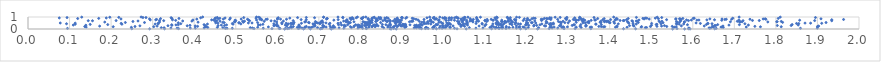
| Category | Series 0 |
|---|---|
| 0.6175389052844268 | 0.001 |
| 1.5514598803826851 | 0.002 |
| 0.8862261077921857 | 0.003 |
| 1.5803423341520886 | 0.004 |
| 0.7302238954797006 | 0.005 |
| 1.5934665258275005 | 0.006 |
| 0.6630879737074858 | 0.007 |
| 0.6797077981641334 | 0.008 |
| 1.0546023714074624 | 0.009 |
| 0.8741624655171963 | 0.01 |
| 1.2263431523334254 | 0.011 |
| 0.2927707433407426 | 0.012 |
| 0.8715716879199482 | 0.013 |
| 1.0325646072678847 | 0.014 |
| 0.7032263728075684 | 0.015 |
| 0.328579404593739 | 0.016 |
| 1.1852969910200903 | 0.017 |
| 1.4623918514825132 | 0.018 |
| 1.6527408964845154 | 0.019 |
| 1.198114778528541 | 0.02 |
| 1.4332483855575386 | 0.021 |
| 0.9829870670767886 | 0.022 |
| 0.2498052021214704 | 0.023 |
| 1.2900873988770873 | 0.024 |
| 1.115719411291491 | 0.025 |
| 0.5872048411137388 | 0.026 |
| 1.354640476689291 | 0.027 |
| 1.5895235533156642 | 0.028 |
| 1.5619479425193956 | 0.029 |
| 0.9469853076404345 | 0.03 |
| 1.3168192192292856 | 0.031 |
| 0.36247602160069425 | 0.032 |
| 0.6251082492186939 | 0.033 |
| 0.7075305288472977 | 0.034 |
| 0.5440397560126725 | 0.035 |
| 0.7282188846044405 | 0.036 |
| 0.8148297504714209 | 0.037 |
| 1.2544038290305506 | 0.038 |
| 0.620267480345095 | 0.039 |
| 0.9562398707732453 | 0.04 |
| 0.6047632280836258 | 0.041 |
| 0.6064364022224148 | 0.042 |
| 0.6504781241232617 | 0.043 |
| 0.880093046198075 | 0.044 |
| 0.9630621299070399 | 0.045 |
| 0.9749165097930582 | 0.046 |
| 0.09497803716775532 | 0.047 |
| 0.7051427393609931 | 0.048 |
| 1.1340352769340913 | 0.049 |
| 1.6564295622667595 | 0.05 |
| 0.805288969921897 | 0.051 |
| 0.47490149238226953 | 0.052 |
| 1.1505917765035771 | 0.053 |
| 1.6405993588251482 | 0.054 |
| 1.8591310438254922 | 0.055 |
| 0.49175410216072923 | 0.056 |
| 1.1246650849883841 | 0.057 |
| 1.0263170556672945 | 0.058 |
| 0.760205859279239 | 0.059 |
| 0.9966568158486036 | 0.06 |
| 0.5662754105587295 | 0.061 |
| 0.4789659758578959 | 0.062 |
| 0.8134405272250914 | 0.063 |
| 0.6286298179134066 | 0.064 |
| 0.40263764907417576 | 0.065 |
| 0.665635785426044 | 0.066 |
| 1.1408909308856656 | 0.067 |
| 0.7941233552604132 | 0.068 |
| 0.35889835402859416 | 0.069 |
| 1.8995143630912017 | 0.07 |
| 1.078052200157913 | 0.071 |
| 1.175425549215883 | 0.072 |
| 0.39062952109978 | 0.073 |
| 1.2749031054643252 | 0.074 |
| 1.1501122513997606 | 0.075 |
| 1.261294958450129 | 0.076 |
| 0.941809711085558 | 0.077 |
| 0.6533978398891727 | 0.078 |
| 0.34400842167275425 | 0.079 |
| 0.7344284390944702 | 0.08 |
| 1.1334567932497346 | 0.081 |
| 0.9902392186622612 | 0.082 |
| 1.0948631166243539 | 0.083 |
| 1.5906309328722745 | 0.084 |
| 0.6592405414968628 | 0.085 |
| 1.6436600321943573 | 0.086 |
| 0.5398760327794052 | 0.087 |
| 0.4239000172133238 | 0.088 |
| 0.929222195392732 | 0.089 |
| 1.0159761358762136 | 0.09 |
| 0.9345729713196138 | 0.091 |
| 0.7487522913695686 | 0.092 |
| 1.6392362790418156 | 0.093 |
| 0.9586377844632779 | 0.094 |
| 0.9456671808094337 | 0.095 |
| 0.6342143928255053 | 0.096 |
| 1.1319272493968056 | 0.097 |
| 1.2290899669114217 | 0.098 |
| 1.0041105406627446 | 0.099 |
| 1.1583491885397872 | 0.1 |
| 0.8560517382785114 | 0.101 |
| 0.7291286821243959 | 0.102 |
| 1.1421054049508617 | 0.103 |
| 0.32752694874827104 | 0.104 |
| 0.6781618716742172 | 0.105 |
| 0.6967907535905661 | 0.106 |
| 1.1329027739908413 | 0.107 |
| 0.3207710015110168 | 0.108 |
| 0.7784045402315228 | 0.109 |
| 0.4690037706011727 | 0.11 |
| 0.5349947094291229 | 0.111 |
| 0.9069276292952548 | 0.112 |
| 1.0621042788510668 | 0.113 |
| 1.4857360689934063 | 0.114 |
| 1.1574470341210383 | 0.115 |
| 1.1272226402965502 | 0.116 |
| 0.9570479225106849 | 0.117 |
| 0.6757924741333284 | 0.118 |
| 1.2038835419238574 | 0.119 |
| 1.3313416648832135 | 0.12 |
| 1.48871574274433 | 0.121 |
| 1.1116757726527369 | 0.122 |
| 0.6816116258462996 | 0.123 |
| 0.9592075953408774 | 0.124 |
| 1.6732844615731906 | 0.125 |
| 1.2870515336998336 | 0.126 |
| 1.2851681507650505 | 0.127 |
| 0.4326596557313227 | 0.128 |
| 0.97405061811175 | 0.129 |
| 1.000218919513019 | 0.13 |
| 0.45571675964384606 | 0.131 |
| 0.9771989395242644 | 0.132 |
| 0.8724474903573247 | 0.133 |
| 1.19373305279619 | 0.134 |
| 1.1267323188726805 | 0.135 |
| 0.738307669408656 | 0.136 |
| 0.64819287127847 | 0.137 |
| 1.2894845656489133 | 0.138 |
| 0.24878348436168174 | 0.139 |
| 1.1671606570843225 | 0.14 |
| 1.1815040899397378 | 0.141 |
| 1.4418239958658459 | 0.142 |
| 0.552812310970602 | 0.143 |
| 1.260121873689789 | 0.144 |
| 1.0162225051534535 | 0.145 |
| 1.3194940965588788 | 0.146 |
| 1.1394819201563866 | 0.147 |
| 1.3531846852142917 | 0.148 |
| 0.7338423743478288 | 0.149 |
| 1.5552587372666948 | 0.15 |
| 1.3563761259513405 | 0.151 |
| 1.4138898082504983 | 0.152 |
| 0.8204543016114935 | 0.153 |
| 1.4755901267911335 | 0.154 |
| 0.7983894038497874 | 0.155 |
| 1.6699982318774693 | 0.156 |
| 0.1399641353805794 | 0.157 |
| 1.6679891979162138 | 0.158 |
| 1.2663523329846775 | 0.159 |
| 0.71750707341946 | 0.16 |
| 0.7102825631595809 | 0.161 |
| 0.6664157628633313 | 0.162 |
| 1.6489904822436157 | 0.163 |
| 1.7286067443255901 | 0.164 |
| 0.8657868561351166 | 0.165 |
| 1.1420184350496645 | 0.166 |
| 0.8790232844669892 | 0.167 |
| 0.8204066782358139 | 0.168 |
| 1.006325816798035 | 0.169 |
| 0.4261782808763389 | 0.17 |
| 0.5785530144357264 | 0.171 |
| 1.1913961506630983 | 0.172 |
| 1.0149749705432782 | 0.173 |
| 1.2566079641328507 | 0.174 |
| 0.6851203776322266 | 0.175 |
| 1.29824253463867 | 0.176 |
| 0.9428928140266987 | 0.177 |
| 1.3849451291253816 | 0.178 |
| 0.8279603331337461 | 0.179 |
| 1.41757153540652 | 0.18 |
| 1.115173713700078 | 0.181 |
| 1.7627960855600717 | 0.182 |
| 0.8355238896084944 | 0.183 |
| 1.2879145915268828 | 0.184 |
| 0.8015639413126252 | 0.185 |
| 0.9375140919265857 | 0.186 |
| 0.4292004708875752 | 0.187 |
| 1.5598329425671746 | 0.188 |
| 1.8128432826425431 | 0.189 |
| 1.1204969412292733 | 0.19 |
| 0.20511494552335097 | 0.191 |
| 0.9098587540922194 | 0.192 |
| 0.3025494397300478 | 0.193 |
| 1.3880512362597133 | 0.194 |
| 0.88841381923636 | 0.195 |
| 1.4767950496124924 | 0.196 |
| 0.8521968257536624 | 0.197 |
| 0.7758311855155827 | 0.198 |
| 0.7842431005960219 | 0.199 |
| 1.183365336405945 | 0.2 |
| 0.6384966785270084 | 0.201 |
| 0.9321981357997912 | 0.202 |
| 1.3796927842697717 | 0.203 |
| 0.6537252830444124 | 0.204 |
| 0.9090048768846911 | 0.205 |
| 1.9000998978046735 | 0.206 |
| 0.13665326696026547 | 0.207 |
| 1.1511916893950007 | 0.208 |
| 0.2575089832731263 | 0.209 |
| 1.0419900197147416 | 0.21 |
| 1.4979596831344633 | 0.211 |
| 1.537354776081636 | 0.212 |
| 0.6327699121357951 | 0.213 |
| 0.6698159704004361 | 0.214 |
| 0.9768789821985223 | 0.215 |
| 0.9779774195942831 | 0.216 |
| 0.9987116174073847 | 0.217 |
| 1.3738699783656354 | 0.218 |
| 1.5505312786132501 | 0.219 |
| 1.5137501572077454 | 0.22 |
| 1.7494099648297794 | 0.221 |
| 0.40816466283553043 | 0.222 |
| 0.881649877827484 | 0.223 |
| 0.8040229756067367 | 0.224 |
| 1.0507179536833373 | 0.225 |
| 0.8284513667874249 | 0.226 |
| 0.7127355434040793 | 0.227 |
| 0.6903846911455757 | 0.228 |
| 0.7272139451336087 | 0.229 |
| 1.3424491597218977 | 0.23 |
| 1.901490447806292 | 0.231 |
| 0.9918283015910423 | 0.232 |
| 0.7099634989251801 | 0.233 |
| 1.6471665812205458 | 0.234 |
| 0.7117438817362556 | 0.235 |
| 1.3285643315215518 | 0.236 |
| 0.6021096041379013 | 0.237 |
| 0.8978537189931524 | 0.238 |
| 0.3106962149063418 | 0.239 |
| 0.17243589233540935 | 0.24 |
| 1.4585467993853967 | 0.241 |
| 1.9028604549134767 | 0.242 |
| 0.9069691042133062 | 0.243 |
| 1.417527372339007 | 0.244 |
| 1.524856428656605 | 0.245 |
| 1.6726681942627908 | 0.246 |
| 0.763979981663823 | 0.247 |
| 1.085710369639886 | 0.248 |
| 1.2458963097887703 | 0.249 |
| 1.6275136797661653 | 0.25 |
| 0.6229664228069296 | 0.251 |
| 1.2172996696181038 | 0.252 |
| 0.793637720342067 | 0.253 |
| 0.4024309955035771 | 0.254 |
| 1.175549559962953 | 0.255 |
| 0.7852264638434948 | 0.256 |
| 0.9023413507723627 | 0.257 |
| 1.5725431140112223 | 0.258 |
| 0.8426377251583745 | 0.259 |
| 1.0229002587631515 | 0.26 |
| 0.5919865373114538 | 0.261 |
| 1.1165562561638258 | 0.262 |
| 0.2693364484235732 | 0.263 |
| 1.2815150033179892 | 0.264 |
| 1.0994192504453555 | 0.265 |
| 1.2429121323359305 | 0.266 |
| 0.38316349048064 | 0.267 |
| 0.8907847944065135 | 0.268 |
| 0.5992385426643675 | 0.269 |
| 1.279195779219525 | 0.27 |
| 0.7349316017198878 | 0.271 |
| 0.8121607652268469 | 0.272 |
| 0.7606751388245597 | 0.273 |
| 0.3368513161402359 | 0.274 |
| 1.0420946999574225 | 0.275 |
| 1.343580852347137 | 0.276 |
| 0.8669937654945603 | 0.277 |
| 1.4476654253284928 | 0.278 |
| 0.4264567148602063 | 0.279 |
| 0.6520660113077269 | 0.28 |
| 1.0092922655405205 | 0.281 |
| 1.5317969068003348 | 0.282 |
| 0.9976748800761285 | 0.283 |
| 0.457566979039715 | 0.284 |
| 0.9347789939730708 | 0.285 |
| 1.0049272896767358 | 0.286 |
| 1.6524921405220028 | 0.287 |
| 1.6552200343299588 | 0.288 |
| 0.4731000569558621 | 0.289 |
| 0.7982168263639948 | 0.29 |
| 1.803499465805352 | 0.291 |
| 1.457009278705204 | 0.292 |
| 1.8367459889458502 | 0.293 |
| 0.831257152735092 | 0.294 |
| 1.0090496827500737 | 0.295 |
| 1.140667909484096 | 0.296 |
| 0.9399144839833659 | 0.297 |
| 1.3097120430017615 | 0.298 |
| 1.2243447056582912 | 0.299 |
| 1.2052187553997582 | 0.3 |
| 0.930541144134727 | 0.301 |
| 0.9087824350243997 | 0.302 |
| 0.8387135397647665 | 0.303 |
| 0.38986616175170563 | 0.304 |
| 0.6905199395269023 | 0.305 |
| 0.34631340429571333 | 0.306 |
| 1.217952121427547 | 0.307 |
| 1.5005003488147137 | 0.308 |
| 0.7093784092568851 | 0.309 |
| 0.8145278717453931 | 0.31 |
| 0.870217897775828 | 0.311 |
| 0.8098133602772419 | 0.312 |
| 0.9484818569580065 | 0.313 |
| 0.7615965180919608 | 0.314 |
| 0.8376840852062013 | 0.315 |
| 0.13929552671506373 | 0.316 |
| 0.8219586360530406 | 0.317 |
| 1.3426287314229803 | 0.318 |
| 1.0448737160386894 | 0.319 |
| 0.9348557808270567 | 0.32 |
| 0.5969783915343586 | 0.321 |
| 0.5921560185070585 | 0.322 |
| 0.6194562467238934 | 0.323 |
| 0.46541042348177375 | 0.324 |
| 1.6870647499464888 | 0.325 |
| 0.8854878819253906 | 0.326 |
| 1.0484695544863747 | 0.327 |
| 1.7338307573452272 | 0.328 |
| 0.8964841466732996 | 0.329 |
| 0.10897448538240473 | 0.33 |
| 1.1976299079447983 | 0.331 |
| 1.853651249754613 | 0.332 |
| 1.057764488549244 | 0.333 |
| 1.4564642315163367 | 0.334 |
| 0.7545814549801316 | 0.335 |
| 0.5544717405534062 | 0.336 |
| 1.2825219780014372 | 0.337 |
| 0.8727209754406929 | 0.338 |
| 0.6522290699184915 | 0.339 |
| 1.2588624155855896 | 0.34 |
| 0.4778302369120022 | 0.341 |
| 0.3561040481457062 | 0.342 |
| 0.559176517742204 | 0.343 |
| 1.3152103955276297 | 0.344 |
| 0.9194174589013048 | 0.345 |
| 0.7944005854011662 | 0.346 |
| 0.98365624732991 | 0.347 |
| 1.2321728823212545 | 0.348 |
| 0.7888042519614505 | 0.349 |
| 1.1319716735721705 | 0.35 |
| 0.7474289098898297 | 0.351 |
| 0.3618136956485707 | 0.352 |
| 0.8329675278130915 | 0.353 |
| 0.3458509741679564 | 0.354 |
| 1.5871223510105223 | 0.355 |
| 1.3135560230340737 | 0.356 |
| 1.3799505907884582 | 0.357 |
| 1.1647062035891138 | 0.358 |
| 0.8613892001821246 | 0.359 |
| 1.712166879352858 | 0.36 |
| 0.769427881962204 | 0.361 |
| 1.1375945098181237 | 0.362 |
| 0.9057059711260449 | 0.363 |
| 0.42372347092931095 | 0.364 |
| 1.6599224342000176 | 0.365 |
| 0.19196277301161457 | 0.366 |
| 1.3305440936683595 | 0.367 |
| 1.5118522489160875 | 0.368 |
| 0.9859612993527271 | 0.369 |
| 1.8390964095895623 | 0.37 |
| 0.9818082962012589 | 0.371 |
| 0.9463930102577971 | 0.372 |
| 0.9027522161843382 | 0.373 |
| 1.1022031628523896 | 0.374 |
| 0.8529098650517787 | 0.375 |
| 1.632807538311662 | 0.376 |
| 1.040916747944265 | 0.377 |
| 1.1988089454227282 | 0.378 |
| 0.6875671704716221 | 0.379 |
| 0.817268853013415 | 0.38 |
| 1.1349285399304283 | 0.381 |
| 0.8940912518033524 | 0.382 |
| 0.1496534157409226 | 0.383 |
| 1.2556933102174355 | 0.384 |
| 1.1277762146616344 | 0.385 |
| 0.9023441935949232 | 0.386 |
| 1.1437245566824885 | 0.387 |
| 0.9438747101751702 | 0.388 |
| 0.9084674256597169 | 0.389 |
| 1.0168020834321179 | 0.39 |
| 0.5653549815332106 | 0.391 |
| 0.8389445057087281 | 0.392 |
| 1.0116126976776894 | 0.393 |
| 1.5617120890402796 | 0.394 |
| 0.8181814033170333 | 0.395 |
| 0.1135675152594886 | 0.396 |
| 1.5135549442707164 | 0.397 |
| 0.5989976176530191 | 0.398 |
| 0.6255193184350871 | 0.399 |
| 0.22600908908707684 | 0.4 |
| 0.49352458543069544 | 0.401 |
| 1.2011710863195613 | 0.402 |
| 1.5672573293263907 | 0.403 |
| 1.3671715452396724 | 0.404 |
| 1.2607962504382138 | 0.405 |
| 0.7248073204181456 | 0.406 |
| 1.0932628163946307 | 0.407 |
| 1.3663632214991286 | 0.408 |
| 0.6354050988781795 | 0.409 |
| 0.4318329796434155 | 0.41 |
| 1.1381905263878849 | 0.411 |
| 0.30596472876799696 | 0.412 |
| 0.9695592216671209 | 0.413 |
| 1.2552392151597647 | 0.414 |
| 1.4640743303680739 | 0.415 |
| 1.0372131853504005 | 0.416 |
| 1.1852785819979543 | 0.417 |
| 1.5780325716658679 | 0.418 |
| 0.8951232656659818 | 0.419 |
| 1.2366769755676663 | 0.42 |
| 1.2646747106276108 | 0.421 |
| 1.1799606082294367 | 0.422 |
| 1.159794874872326 | 0.423 |
| 0.5123952411632808 | 0.424 |
| 0.804117754639806 | 0.425 |
| 1.172533979390298 | 0.426 |
| 0.6262476447939326 | 0.427 |
| 1.4207329646376001 | 0.428 |
| 1.1189608963389088 | 0.429 |
| 0.685905704088343 | 0.43 |
| 0.6899952894875362 | 0.431 |
| 0.3136140423241496 | 0.432 |
| 0.6390196956215706 | 0.433 |
| 1.0541112099327994 | 0.434 |
| 1.5235950940583485 | 0.435 |
| 0.5917275987802044 | 0.436 |
| 0.09275645145315348 | 0.437 |
| 0.6111869131293373 | 0.438 |
| 1.7253922976920482 | 0.439 |
| 0.8171611579950551 | 0.44 |
| 0.6379124923615741 | 0.441 |
| 1.6462583977475365 | 0.442 |
| 0.36770958436877677 | 0.443 |
| 0.7022351447926696 | 0.444 |
| 1.010300386170638 | 0.445 |
| 0.8231944284990431 | 0.446 |
| 1.1286911736462737 | 0.447 |
| 0.9532616891362443 | 0.448 |
| 1.560535694919379 | 0.449 |
| 1.0482661657369192 | 0.45 |
| 0.9980302880035751 | 0.451 |
| 1.6365001370487486 | 0.452 |
| 1.855081892726925 | 0.453 |
| 1.0132990297832491 | 0.454 |
| 0.9579319150343226 | 0.455 |
| 0.49186397111108127 | 0.456 |
| 1.2582194885733888 | 0.457 |
| 1.0148112171362098 | 0.458 |
| 1.0927977614265962 | 0.459 |
| 1.5009416626875223 | 0.46 |
| 1.0783877546618559 | 0.461 |
| 1.849763264710619 | 0.462 |
| 1.618268656023135 | 0.463 |
| 0.6321770104197865 | 0.464 |
| 1.161529756567457 | 0.465 |
| 0.9973058183310968 | 0.466 |
| 1.0572070055598202 | 0.467 |
| 0.31285177349254667 | 0.468 |
| 0.9634734495226811 | 0.469 |
| 0.22431175677258264 | 0.47 |
| 1.6358012852361739 | 0.471 |
| 0.884555731142105 | 0.472 |
| 1.9102654353109045 | 0.473 |
| 1.0379922671407988 | 0.474 |
| 1.4562302270608183 | 0.475 |
| 0.7460445797901174 | 0.476 |
| 0.6213453672803094 | 0.477 |
| 0.7037191313029751 | 0.478 |
| 0.6581458977725725 | 0.479 |
| 0.7267173400765574 | 0.48 |
| 0.9531287763750577 | 0.481 |
| 0.8711827482296735 | 0.482 |
| 0.7724538038577508 | 0.483 |
| 1.446052221184274 | 0.484 |
| 0.4570654865807191 | 0.485 |
| 1.411609530757088 | 0.486 |
| 1.883473422190916 | 0.487 |
| 1.2468206079218207 | 0.488 |
| 0.11360547066761684 | 0.489 |
| 0.6353566137445732 | 0.49 |
| 1.264280059672167 | 0.491 |
| 1.8701010971067364 | 0.492 |
| 1.1469209381834777 | 0.493 |
| 1.199359549072121 | 0.494 |
| 1.0363352646695163 | 0.495 |
| 0.9618778710860366 | 0.496 |
| 0.8124835677454425 | 0.497 |
| 1.1264651132376131 | 0.498 |
| 1.2220825898044891 | 0.499 |
| 0.07764378302198083 | 0.5 |
| 1.2827379780676478 | 0.501 |
| 0.6974200890293707 | 0.502 |
| 0.5391601813535468 | 0.503 |
| 0.5303835982077557 | 0.504 |
| 1.6079037936603016 | 0.505 |
| 0.7172650466221292 | 0.506 |
| 0.8140718721400299 | 0.507 |
| 1.3414364096813198 | 0.508 |
| 1.2028152347407697 | 0.509 |
| 0.7030248276709546 | 0.51 |
| 0.4517925345737055 | 0.511 |
| 1.3498668114367627 | 0.512 |
| 0.5071751237163289 | 0.513 |
| 1.0078432817314842 | 0.514 |
| 0.7525550898681898 | 0.515 |
| 0.3616977215446613 | 0.516 |
| 0.6107941642702497 | 0.517 |
| 0.6767133383692387 | 0.518 |
| 1.300107128214147 | 0.519 |
| 1.4007019395629117 | 0.52 |
| 1.3357156851050485 | 0.521 |
| 0.508517416479865 | 0.522 |
| 1.528294014804204 | 0.523 |
| 0.8235245480878642 | 0.524 |
| 1.211836791129084 | 0.525 |
| 1.3789223898454654 | 0.526 |
| 1.173920510386947 | 0.527 |
| 1.2135603885623447 | 0.528 |
| 1.1318434656042284 | 0.529 |
| 0.47228765464660327 | 0.53 |
| 1.2920043272538855 | 0.531 |
| 0.5527360882817144 | 0.532 |
| 0.7758430819940352 | 0.533 |
| 1.0573234104830127 | 0.534 |
| 0.772463124136315 | 0.535 |
| 1.468763894999336 | 0.536 |
| 0.8486600524479333 | 0.537 |
| 1.9206904059847472 | 0.538 |
| 1.283313023750044 | 0.539 |
| 0.28040741384124945 | 0.54 |
| 0.2343132912868895 | 0.541 |
| 0.8279468356035943 | 0.542 |
| 0.6937608667355132 | 0.543 |
| 0.8113092490542457 | 0.544 |
| 0.7099185857206284 | 0.545 |
| 1.249221128210808 | 0.546 |
| 0.8965419833886488 | 0.547 |
| 0.6752251688862457 | 0.548 |
| 0.6402688926557578 | 0.549 |
| 0.9888884786306184 | 0.55 |
| 0.816348862216705 | 0.551 |
| 0.46891692126862516 | 0.552 |
| 0.6935399786601656 | 0.553 |
| 1.8161354134773875 | 0.554 |
| 1.3194247935061159 | 0.555 |
| 0.809982747655481 | 0.556 |
| 1.5623794370181647 | 0.557 |
| 1.1735800849791342 | 0.558 |
| 0.9477801744872849 | 0.559 |
| 0.975442955746335 | 0.56 |
| 1.3991806853722113 | 0.561 |
| 0.7044965163301556 | 0.562 |
| 0.8839824594218143 | 0.563 |
| 1.1662014238118945 | 0.564 |
| 0.518344369968192 | 0.565 |
| 1.3768969374672797 | 0.566 |
| 0.8226153529459447 | 0.567 |
| 1.2809029585931604 | 0.568 |
| 0.409335746308918 | 0.569 |
| 1.5679496926025225 | 0.57 |
| 1.346629457695562 | 0.571 |
| 1.1512024855303995 | 0.572 |
| 0.9935174819657859 | 0.573 |
| 1.397828054540542 | 0.574 |
| 0.8227636048032508 | 0.575 |
| 0.18477667482075422 | 0.576 |
| 0.821451300203306 | 0.577 |
| 0.8880535543654974 | 0.578 |
| 1.5207770670340817 | 0.579 |
| 1.5798121495185002 | 0.58 |
| 1.443981081017096 | 0.581 |
| 0.8877625157106218 | 0.582 |
| 0.3165942783234367 | 0.583 |
| 0.598402258299241 | 0.584 |
| 1.7136172085170274 | 0.585 |
| 1.0449279236094062 | 0.586 |
| 0.7657183136993142 | 0.587 |
| 1.7805790884407375 | 0.588 |
| 0.9711569335002874 | 0.589 |
| 1.070948864507454 | 0.59 |
| 1.3491346253801555 | 0.591 |
| 0.6660332402883057 | 0.592 |
| 1.5796370082311726 | 0.593 |
| 0.4968660323389452 | 0.594 |
| 1.4098346033453453 | 0.595 |
| 0.8911993093808344 | 0.596 |
| 0.7845691420834103 | 0.597 |
| 1.8021210380434671 | 0.598 |
| 0.9181597753661231 | 0.599 |
| 0.7704513827968332 | 0.6 |
| 0.9528130877639223 | 0.601 |
| 1.6904471927139824 | 0.602 |
| 0.6681635238831373 | 0.603 |
| 1.7186993655108709 | 0.604 |
| 1.7144247761203302 | 0.605 |
| 0.8639196090936185 | 0.606 |
| 1.3873996937745667 | 0.607 |
| 1.3927493127595132 | 0.608 |
| 1.1648196382872968 | 0.609 |
| 1.442872067149972 | 0.61 |
| 1.8030386752082292 | 0.611 |
| 0.9618934037257816 | 0.612 |
| 1.1415469843970485 | 0.613 |
| 0.8062759523809099 | 0.614 |
| 0.705940419916665 | 0.615 |
| 0.4984275684140461 | 0.616 |
| 0.8848758349538128 | 0.617 |
| 1.0373245582686108 | 0.618 |
| 1.148062072500625 | 0.619 |
| 1.1394882883026924 | 0.62 |
| 0.691655940840571 | 0.621 |
| 1.5607325239695042 | 0.622 |
| 1.1035720219544518 | 0.623 |
| 1.0796944495508138 | 0.624 |
| 1.2765641514350556 | 0.625 |
| 1.0559220277734878 | 0.626 |
| 0.252555386582369 | 0.627 |
| 0.8367852520450976 | 0.628 |
| 1.3500439354771632 | 0.629 |
| 1.147752677720245 | 0.63 |
| 0.9419952022374933 | 0.631 |
| 1.8128873271481254 | 0.632 |
| 1.7112694337091996 | 0.633 |
| 0.5683593740308911 | 0.634 |
| 0.8947253192513819 | 0.635 |
| 0.9224236569797765 | 0.636 |
| 1.156920012770962 | 0.637 |
| 0.5166992619746978 | 0.638 |
| 0.45073634314389166 | 0.639 |
| 1.7070734148189133 | 0.64 |
| 1.2472397807879831 | 0.641 |
| 1.3873993495281807 | 0.642 |
| 0.9261129086076109 | 0.643 |
| 1.5257330733298091 | 0.644 |
| 0.4623249876086878 | 0.645 |
| 1.0334972583688593 | 0.646 |
| 1.4549731454525872 | 0.647 |
| 1.2878196349215516 | 0.648 |
| 0.8383597212480458 | 0.649 |
| 0.5210331857634591 | 0.65 |
| 1.08447154867622 | 0.651 |
| 1.33620798211825 | 0.652 |
| 1.3786954587864866 | 0.653 |
| 1.4664685894669114 | 0.654 |
| 0.8722151419076861 | 0.655 |
| 1.335290183321752 | 0.656 |
| 0.3944096688281735 | 0.657 |
| 0.6146395076210288 | 0.658 |
| 0.7665903578486627 | 0.659 |
| 1.0635260411614258 | 0.66 |
| 0.7597272940918401 | 0.661 |
| 1.1289056060287082 | 0.662 |
| 1.391026502064554 | 0.663 |
| 1.4638730879755313 | 0.664 |
| 1.3958291922292658 | 0.665 |
| 1.5184261408247437 | 0.666 |
| 0.2647631578440419 | 0.667 |
| 0.3723506087299785 | 0.668 |
| 1.21975216985783 | 0.669 |
| 0.5935700044300407 | 0.67 |
| 0.8791210537120293 | 0.671 |
| 1.3033957547453934 | 0.672 |
| 0.8661896468839319 | 0.673 |
| 0.8847180261673592 | 0.674 |
| 0.9246933345008701 | 0.675 |
| 0.8249053753401613 | 0.676 |
| 0.9668433583540773 | 0.677 |
| 1.0690402776172405 | 0.678 |
| 1.0464409828431918 | 0.679 |
| 1.1997401523905782 | 0.68 |
| 1.1554313100649907 | 0.681 |
| 0.7079759323112235 | 0.682 |
| 1.453506847321022 | 0.683 |
| 0.5851013967355405 | 0.684 |
| 0.1551887019252769 | 0.685 |
| 0.45427773647033887 | 0.686 |
| 1.5709493761261157 | 0.687 |
| 0.533383000312781 | 0.688 |
| 0.9700792085223251 | 0.689 |
| 1.9343906878105896 | 0.69 |
| 1.1060470045550956 | 0.691 |
| 0.14503206714757588 | 0.692 |
| 1.7209248980201197 | 0.693 |
| 0.3266077338685279 | 0.694 |
| 0.6382666899759951 | 0.695 |
| 0.8542215356657846 | 0.696 |
| 1.0690340599442512 | 0.697 |
| 1.589603631431733 | 0.698 |
| 0.49995883570148714 | 0.699 |
| 1.4325618678631198 | 0.7 |
| 1.8933360229887857 | 0.701 |
| 0.21207973085629483 | 0.702 |
| 1.0996983597569756 | 0.703 |
| 0.8604422712678265 | 0.704 |
| 1.7599643074989086 | 0.705 |
| 1.4345219875822477 | 0.706 |
| 1.1918991042110634 | 0.707 |
| 1.2360073612590807 | 0.708 |
| 0.7667814825145167 | 0.709 |
| 1.4249561915489555 | 0.71 |
| 0.3165011392046817 | 0.711 |
| 1.0060641656556053 | 0.712 |
| 1.7436246568070404 | 0.713 |
| 0.9881126195539641 | 0.714 |
| 0.8215733897070356 | 0.715 |
| 1.1623446020121264 | 0.716 |
| 1.1733540650210779 | 0.717 |
| 0.8710948930809277 | 0.718 |
| 0.8947820308709816 | 0.719 |
| 0.35542227556513584 | 0.72 |
| 1.1000268430736453 | 0.721 |
| 1.3555009315375832 | 0.722 |
| 0.7671811915783323 | 0.723 |
| 1.3176173715727435 | 0.724 |
| 1.20795719450821 | 0.725 |
| 1.6698147162394323 | 0.726 |
| 1.0124434621335663 | 0.727 |
| 1.0263645793728227 | 0.728 |
| 1.8571695524210403 | 0.729 |
| 0.8413502968870102 | 0.73 |
| 1.1189460484263378 | 0.731 |
| 1.320065531303487 | 0.732 |
| 1.340079310330509 | 0.733 |
| 0.4982903914593221 | 0.734 |
| 0.8284324587727931 | 0.735 |
| 1.1196429216072823 | 0.736 |
| 1.140200639312213 | 0.737 |
| 0.7361454619818277 | 0.738 |
| 0.8986975132401405 | 0.739 |
| 1.6099372866882764 | 0.74 |
| 1.0553292665406935 | 0.741 |
| 1.5703809405352616 | 0.742 |
| 0.5310775800304708 | 0.743 |
| 0.5500411299248602 | 0.744 |
| 1.3327885669295676 | 0.745 |
| 1.596551343508269 | 0.746 |
| 1.4705541147987322 | 0.747 |
| 1.6147382563410413 | 0.748 |
| 1.711069639357282 | 0.749 |
| 0.39701926230527573 | 0.75 |
| 1.3249851693696089 | 0.751 |
| 1.3658776119238765 | 0.752 |
| 1.3638860307722234 | 0.753 |
| 0.44704312044463523 | 0.754 |
| 1.5848834699354153 | 0.755 |
| 1.4132078848981067 | 0.756 |
| 1.043137780249829 | 0.757 |
| 1.6338464557635048 | 0.758 |
| 0.29429207682946934 | 0.759 |
| 0.44196118794228645 | 0.76 |
| 1.0186985948214384 | 0.761 |
| 0.9385943459006452 | 0.762 |
| 0.307359542402709 | 0.763 |
| 0.3477212856950873 | 0.764 |
| 1.3183239139451093 | 0.765 |
| 1.3831818239514095 | 0.766 |
| 1.652259050779017 | 0.767 |
| 0.9892763862987911 | 0.768 |
| 1.065571793938013 | 0.769 |
| 0.8905534319139025 | 0.77 |
| 1.9344244958509114 | 0.771 |
| 0.6697061512442984 | 0.772 |
| 0.7675437319813079 | 0.773 |
| 1.173918452186178 | 0.774 |
| 1.2028059796814843 | 0.775 |
| 0.5623871542076283 | 0.776 |
| 1.5369353794858016 | 0.777 |
| 1.4405007178582547 | 0.778 |
| 0.9687228681855317 | 0.779 |
| 0.8879349351177741 | 0.78 |
| 0.7465099398322079 | 0.781 |
| 1.2957129460989285 | 0.782 |
| 0.6573844887296949 | 0.783 |
| 0.5619261786343803 | 0.784 |
| 1.4022484281266885 | 0.785 |
| 1.4145015087810395 | 0.786 |
| 1.0812312043701322 | 0.787 |
| 1.1708383957740816 | 0.788 |
| 1.0495591104267992 | 0.789 |
| 0.777270736225913 | 0.79 |
| 0.85920398602812 | 0.791 |
| 1.6771973089415257 | 0.792 |
| 1.258193727447523 | 0.793 |
| 1.9628972212847309 | 0.794 |
| 0.9531243227926169 | 0.795 |
| 1.3124478779688165 | 0.796 |
| 1.1050666523991817 | 0.797 |
| 0.30955918549388917 | 0.798 |
| 1.2386039973791951 | 0.799 |
| 1.1257351903863775 | 0.8 |
| 1.0718098065340116 | 0.801 |
| 0.5726266497546212 | 0.802 |
| 0.48521296024767957 | 0.803 |
| 1.081059520206951 | 0.804 |
| 1.1147525081200755 | 0.805 |
| 0.9338417672252475 | 0.806 |
| 1.274702717555595 | 0.807 |
| 0.9793684395592691 | 0.808 |
| 0.5581254906689217 | 0.809 |
| 1.775917861546382 | 0.81 |
| 0.5283264198194211 | 0.811 |
| 1.7375995456007862 | 0.812 |
| 1.693463048396119 | 0.813 |
| 1.6806463280150101 | 0.814 |
| 0.6221006296060902 | 0.815 |
| 1.235275618856298 | 0.816 |
| 0.8830941433298947 | 0.817 |
| 1.3364102550338672 | 0.818 |
| 0.8894051441212109 | 0.819 |
| 0.6078303613890886 | 0.82 |
| 0.5759711087797931 | 0.821 |
| 0.8378524067688565 | 0.822 |
| 0.4700989112112336 | 0.823 |
| 0.6004699106325248 | 0.824 |
| 0.406253264437172 | 0.825 |
| 1.55876289854814 | 0.826 |
| 1.4183638236398677 | 0.827 |
| 1.495037457920019 | 0.828 |
| 0.7184849300703602 | 0.829 |
| 0.5130633414371911 | 0.83 |
| 1.1605683234885114 | 0.831 |
| 0.7830233409206588 | 0.832 |
| 0.8182123684030491 | 0.833 |
| 1.0424134654956914 | 0.834 |
| 1.6703398712548156 | 0.835 |
| 1.4827172930605572 | 0.836 |
| 0.22382284152763388 | 0.837 |
| 1.7693522291156494 | 0.838 |
| 1.5708875261316047 | 0.839 |
| 0.2924708249736403 | 0.84 |
| 1.1562854337569313 | 0.841 |
| 0.9819503327964454 | 0.842 |
| 1.6411414103139756 | 0.843 |
| 1.3313508785914252 | 0.844 |
| 0.8391213042994304 | 0.845 |
| 0.4582611696462814 | 0.846 |
| 0.849105483647824 | 0.847 |
| 1.5597024104963595 | 0.848 |
| 1.1946287044322723 | 0.849 |
| 1.9084996188781462 | 0.85 |
| 1.774131150003426 | 0.851 |
| 0.9830173753588263 | 0.852 |
| 0.8272867960140265 | 0.853 |
| 1.5679161951752505 | 0.854 |
| 1.296087219290459 | 0.855 |
| 1.050026152040932 | 0.856 |
| 0.9285199199291493 | 0.857 |
| 0.8040602080376822 | 0.858 |
| 0.8463887046113333 | 0.859 |
| 1.5172553392381696 | 0.86 |
| 1.2496247814117112 | 0.861 |
| 1.2542431038827333 | 0.862 |
| 0.7196500769358909 | 0.863 |
| 1.2130271510621873 | 0.864 |
| 1.0640938939180589 | 0.865 |
| 0.319041207836516 | 0.866 |
| 0.818839895406924 | 0.867 |
| 1.3866370189212467 | 0.868 |
| 0.34648615926496174 | 0.869 |
| 0.4504450803835581 | 0.87 |
| 1.002589269458193 | 0.871 |
| 0.11957855331284761 | 0.872 |
| 1.3711057393686692 | 0.873 |
| 1.2477404101170646 | 0.874 |
| 1.4446070350111184 | 0.875 |
| 0.8030868784371329 | 0.876 |
| 1.5761095582552977 | 0.877 |
| 0.7202898695014214 | 0.878 |
| 1.2935129356672301 | 0.879 |
| 0.3633411699403033 | 0.88 |
| 0.6004352453374453 | 0.881 |
| 1.4160728613845257 | 0.882 |
| 1.2022654443837728 | 0.883 |
| 1.8057274459096573 | 0.884 |
| 0.17021409634839135 | 0.885 |
| 1.2428436284209181 | 0.886 |
| 1.4798735384927268 | 0.887 |
| 1.2207049052717929 | 0.888 |
| 0.8670322507902404 | 0.889 |
| 1.601212412300982 | 0.89 |
| 0.46174494653973563 | 0.891 |
| 0.9776063114026158 | 0.892 |
| 0.8029692132190338 | 0.893 |
| 0.924739898153297 | 0.894 |
| 1.0062440012994023 | 0.895 |
| 1.603405160258284 | 0.896 |
| 1.0354626838943601 | 0.897 |
| 1.6962021795629592 | 0.898 |
| 0.9090855742249679 | 0.899 |
| 1.4892553518418956 | 0.9 |
| 1.0800723584543572 | 0.901 |
| 1.2168838326725053 | 0.902 |
| 0.7750800084984689 | 0.903 |
| 1.5097382510626964 | 0.904 |
| 0.5487353586282434 | 0.905 |
| 1.0347690181450795 | 0.906 |
| 0.7784904397492782 | 0.907 |
| 0.48693659186440985 | 0.908 |
| 0.6301176443000687 | 0.909 |
| 1.4855080371107074 | 0.91 |
| 0.4509656889030115 | 0.911 |
| 1.3278275249122373 | 0.912 |
| 0.8049720178595048 | 0.913 |
| 0.8588060934620192 | 0.914 |
| 1.0132672206995066 | 0.915 |
| 0.5585967024779331 | 0.916 |
| 1.2592446370338508 | 0.917 |
| 0.474339676227839 | 0.918 |
| 1.047479505986158 | 0.919 |
| 0.8886275134401073 | 0.92 |
| 0.18840924139959048 | 0.921 |
| 0.9010982578961855 | 0.922 |
| 1.0146541459868907 | 0.923 |
| 0.07533646063935351 | 0.924 |
| 1.0266206101711055 | 0.925 |
| 0.8287756130182621 | 0.926 |
| 0.9750538194777815 | 0.927 |
| 0.9980854314006616 | 0.928 |
| 1.3157382526448786 | 0.929 |
| 1.0198662083718957 | 0.93 |
| 1.033771501844916 | 0.931 |
| 0.41547749113394883 | 0.932 |
| 1.1239666321935848 | 0.933 |
| 0.9602329343089097 | 0.934 |
| 0.6023677097213683 | 0.935 |
| 0.7899106243742897 | 0.936 |
| 0.757808010722089 | 0.937 |
| 0.6897175017227858 | 0.938 |
| 1.2559637855989314 | 0.939 |
| 1.1295235241807369 | 0.94 |
| 0.7806934558110579 | 0.941 |
| 0.8988221059590907 | 0.942 |
| 1.3286093811055535 | 0.943 |
| 0.34446864468823724 | 0.944 |
| 1.154082475797319 | 0.945 |
| 0.8488041833846323 | 0.946 |
| 1.1607556982785852 | 0.947 |
| 0.8634460694152797 | 0.948 |
| 0.648796510942722 | 0.949 |
| 0.519268498354099 | 0.95 |
| 0.09397961522381326 | 0.951 |
| 1.5252302610129695 | 0.952 |
| 1.0032507372577315 | 0.953 |
| 0.2839848564665659 | 0.954 |
| 1.8951669459396068 | 0.955 |
| 1.079717130512058 | 0.956 |
| 0.27655403515044785 | 0.957 |
| 0.6698595066223386 | 0.958 |
| 1.362227345897113 | 0.959 |
| 0.4554973683178356 | 0.96 |
| 0.8331686211317885 | 0.961 |
| 0.9114498222927487 | 0.962 |
| 0.8443166192483945 | 0.963 |
| 1.280774158373287 | 0.964 |
| 1.464292876739918 | 0.965 |
| 1.0509839041407631 | 0.966 |
| 1.0512482425444432 | 0.967 |
| 1.1826559736909146 | 0.968 |
| 0.900009229186467 | 0.969 |
| 0.21851451357997043 | 0.97 |
| 1.2969813251227316 | 0.971 |
| 1.1535372603067722 | 0.972 |
| 0.8333469496451932 | 0.973 |
| 0.8070860757772681 | 0.974 |
| 0.9774178178397203 | 0.975 |
| 0.7576672644558966 | 0.976 |
| 1.3276326217073473 | 0.977 |
| 1.2686782354493207 | 0.978 |
| 0.1968520892353236 | 0.979 |
| 0.7112985029725183 | 0.98 |
| 0.7116157340395749 | 0.981 |
| 1.1758658046700567 | 0.982 |
| 1.088891481925668 | 0.983 |
| 0.5557488297782094 | 0.984 |
| 1.5143747618054144 | 0.985 |
| 1.0588165763737565 | 0.986 |
| 0.9912158590057827 | 0.987 |
| 0.12932198788240323 | 0.988 |
| 1.030814945856739 | 0.989 |
| 1.1279461979029335 | 0.99 |
| 1.8105347048525524 | 0.991 |
| 0.9667038418209726 | 0.992 |
| 1.4095899123333768 | 0.993 |
| 1.71153335890922 | 0.994 |
| 0.7460527787352825 | 0.995 |
| 0.7928786647921658 | 0.996 |
| 0.8131098941663629 | 0.997 |
| 0.5500474375705863 | 0.998 |
| 0.4203823091527048 | 0.999 |
| 0.2722300399875166 | 1 |